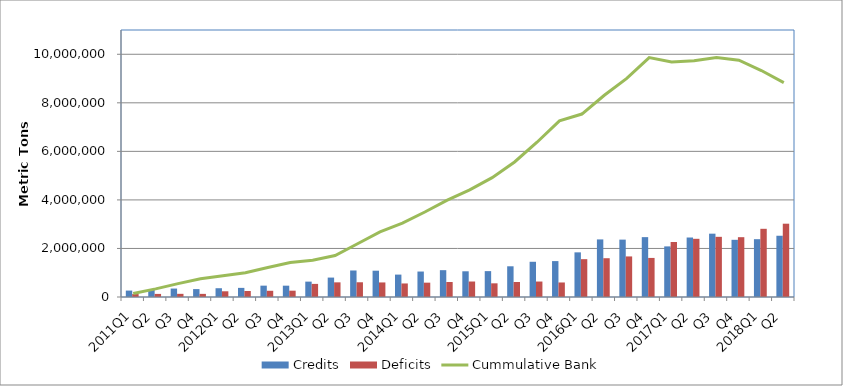
| Category | Credits | Deficits |
|---|---|---|
| 0 | 264651 | 121295 |
| 1 | 317754 | 127443 |
| 2 | 347956 | 130520 |
| 3 | 325697 | 128642 |
| 4 | 361753 | 235622 |
| 5 | 376069 | 248036 |
| 6 | 467480 | 255772 |
| 7 | 466675 | 260296 |
| 8 | 633574 | 539843 |
| 9 | 800111 | 604048 |
| 10 | 1092618 | 607073 |
| 11 | 1083694 | 599914 |
| 12 | 922927 | 557876 |
| 13 | 1049178 | 590666 |
| 14 | 1105520 | 617510 |
| 15 | 1059294 | 637874 |
| 16 | 1066278 | 563458 |
| 17 | 1265300 | 618214 |
| 18 | 1451082 | 637078 |
| 19 | 1479283 | 598537 |
| 20 | 1839408 | 1558613 |
| 21 | 2372431 | 1597710 |
| 22 | 2363831 | 1671397 |
| 23 | 2466297 | 1609775 |
| 24 | 2085009 | 2264850 |
| 25 | 2450778 | 2397146 |
| 26 | 2609076 | 2478872 |
| 27 | 2356060 | 2464378 |
| 28 | 2382076 | 2809548 |
| 29 | 2523330 | 3020013 |